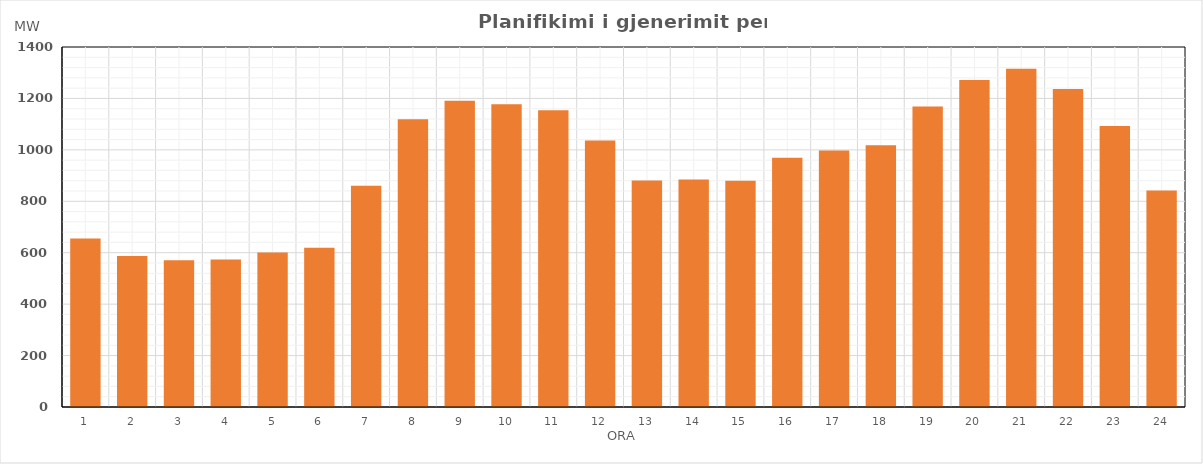
| Category | Max (MW) |
|---|---|
| 0 | 654.95 |
| 1 | 586.91 |
| 2 | 570.93 |
| 3 | 573.91 |
| 4 | 600.94 |
| 5 | 619.76 |
| 6 | 860.65 |
| 7 | 1118.67 |
| 8 | 1190.8 |
| 9 | 1176.96 |
| 10 | 1153.92 |
| 11 | 1035.91 |
| 12 | 880.9 |
| 13 | 884.83 |
| 14 | 879.71 |
| 15 | 969.65 |
| 16 | 997.64 |
| 17 | 1017.58 |
| 18 | 1168.84 |
| 19 | 1271.81 |
| 20 | 1315.87 |
| 21 | 1236.86 |
| 22 | 1092.78 |
| 23 | 841.79 |